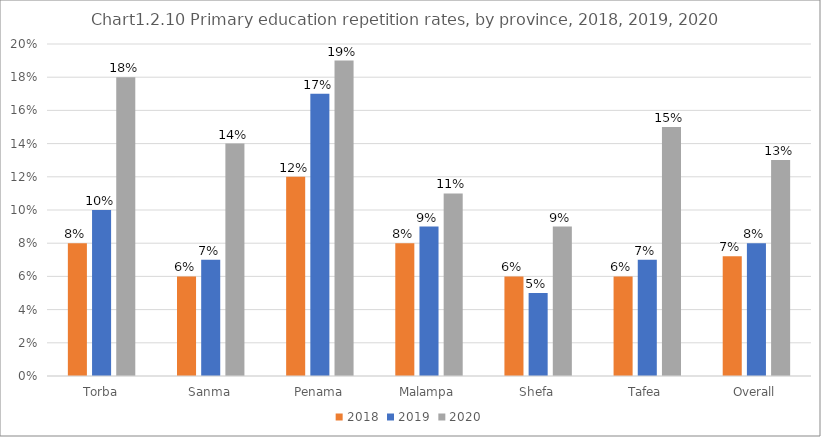
| Category | 2018 | 2019 | 2020 |
|---|---|---|---|
| Torba | 0.08 | 0.1 | 0.18 |
| Sanma | 0.06 | 0.07 | 0.14 |
| Penama | 0.12 | 0.17 | 0.19 |
| Malampa | 0.08 | 0.09 | 0.11 |
| Shefa | 0.06 | 0.05 | 0.09 |
| Tafea | 0.06 | 0.07 | 0.15 |
| Overall | 0.072 | 0.08 | 0.13 |